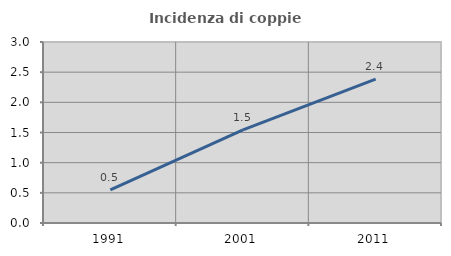
| Category | Incidenza di coppie miste |
|---|---|
| 1991.0 | 0.547 |
| 2001.0 | 1.544 |
| 2011.0 | 2.385 |